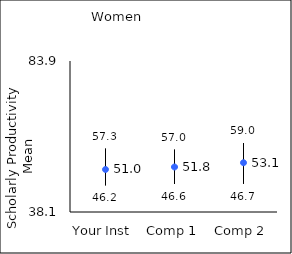
| Category | 25th percentile | 75th percentile | Mean |
|---|---|---|---|
| Your Inst | 46.2 | 57.3 | 51 |
| Comp 1 | 46.6 | 57 | 51.75 |
| Comp 2 | 46.7 | 59 | 53.05 |